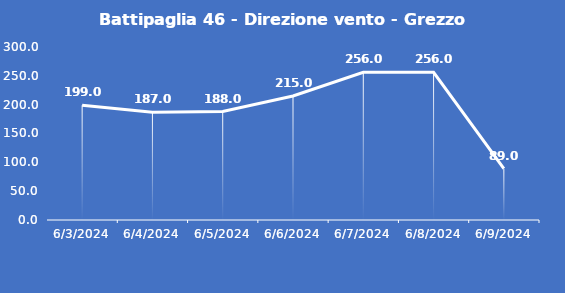
| Category | Battipaglia 46 - Direzione vento - Grezzo (°N) |
|---|---|
| 6/3/24 | 199 |
| 6/4/24 | 187 |
| 6/5/24 | 188 |
| 6/6/24 | 215 |
| 6/7/24 | 256 |
| 6/8/24 | 256 |
| 6/9/24 | 89 |